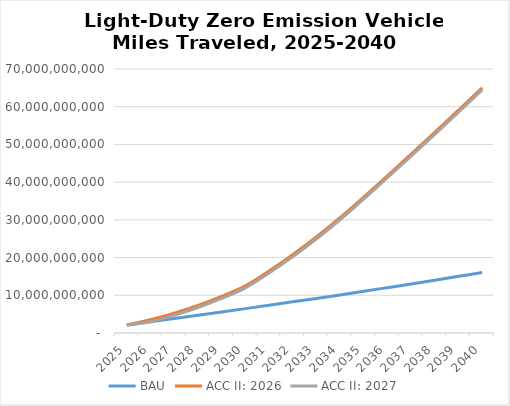
| Category | BAU | ACC II: 2026 | ACC II: 2027 |
|---|---|---|---|
| 2025.0 | 2134743147.778 | 2134743147.778 | 2134743147.778 |
| 2026.0 | 2984006004.731 | 3517273491.836 | 2984006004.731 |
| 2027.0 | 3841871523.986 | 5233024110.22 | 4699760883.59 |
| 2028.0 | 4708271177.408 | 7288239790.771 | 6754981388.941 |
| 2029.0 | 5583150390.971 | 9689114109.055 | 9155859777.394 |
| 2030.0 | 6466441079.489 | 12482834878.019 | 11949584373.583 |
| 2031.0 | 7356206956.166 | 16431849156.907 | 15899178329.322 |
| 2032.0 | 8258721404.994 | 20754293280.117 | 20222187146.883 |
| 2033.0 | 9174051331.958 | 25459640713.148 | 24928085605.977 |
| 2034.0 | 10102272244.021 | 30557445700.94 | 30026428441.868 |
| 2035.0 | 11043453426.75 | 36057307255.571 | 35526815383.313 |
| 2036.0 | 12018757249.204 | 41697218058.733 | 41166152133.26 |
| 2037.0 | 13006973113.334 | 47412915837.866 | 46881289371.104 |
| 2038.0 | 14008065112.408 | 53204185430.314 | 52672011813.527 |
| 2039.0 | 15022054736.325 | 59071035875.861 | 58538326316.037 |
| 2040.0 | 16048876543.545 | 65013150321.566 | 64479917224.693 |